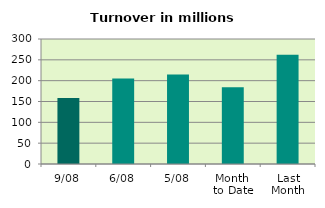
| Category | Series 0 |
|---|---|
| 9/08 | 158.121 |
| 6/08 | 205.459 |
| 5/08 | 214.909 |
| Month 
to Date | 184.005 |
| Last
Month | 262.308 |